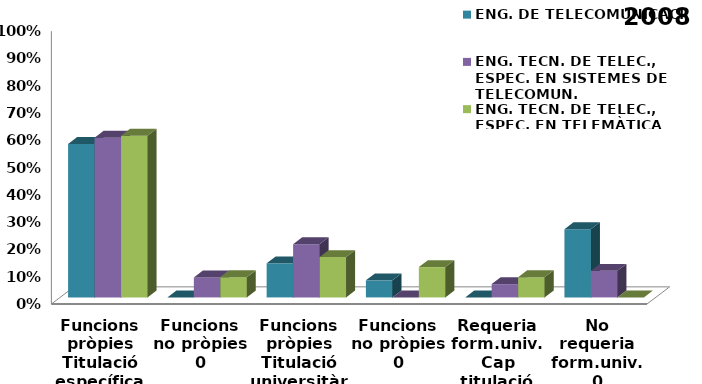
| Category | ENG. DE TELECOMUNICACIÓ | ENG. TECN. DE TELEC., ESPEC. EN SISTEMES DE TELECOMUN. | ENG. TECN. DE TELEC., ESPEC. EN TELEMÀTICA |
|---|---|---|---|
| 0 | 0.562 | 0.585 | 0.593 |
| 1 | 0 | 0.073 | 0.074 |
| 2 | 0.125 | 0.195 | 0.148 |
| 3 | 0.062 | 0 | 0.111 |
| 4 | 0 | 0.049 | 0.074 |
| 5 | 0.25 | 0.098 | 0 |